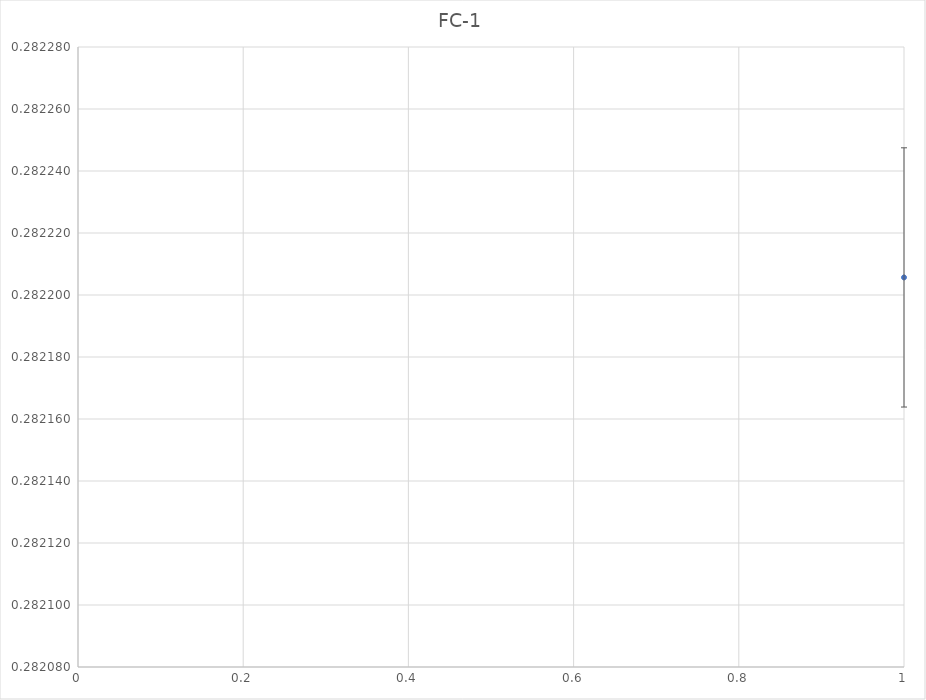
| Category | Series 0 |
|---|---|
| 0 | 0.282 |
| 1 | 0.282 |
| 2 | 0.282 |
| 3 | 0.282 |
| 4 | 0.282 |
| 5 | 0.282 |
| 6 | 0.282 |
| 7 | 0.282 |
| 8 | 0.282 |
| 9 | 0.282 |
| 10 | 0.282 |
| 11 | 0.282 |
| 12 | 0.282 |
| 13 | 0.282 |
| 14 | 0.282 |
| 15 | 0.282 |
| 16 | 0.282 |
| 17 | 0.282 |
| 18 | 0.282 |
| 19 | 0.282 |
| 20 | 0.282 |
| 21 | 0.282 |
| 22 | 0.282 |
| 23 | 0.282 |
| 24 | 0.282 |
| 25 | 0.282 |
| 26 | 0.282 |
| 27 | 0.282 |
| 28 | 0.282 |
| 29 | 0.282 |
| 30 | 0.282 |
| 31 | 0.282 |
| 32 | 0.282 |
| 33 | 0.282 |
| 34 | 0.282 |
| 35 | 0.282 |
| 36 | 0.282 |
| 37 | 0.282 |
| 38 | 0.282 |
| 39 | 0.282 |
| 40 | 0.282 |
| 41 | 0.282 |
| 42 | 0.282 |
| 43 | 0.282 |
| 44 | 0.282 |
| 45 | 0.282 |
| 46 | 0.282 |
| 47 | 0.282 |
| 48 | 0.282 |
| 49 | 0.282 |
| 50 | 0.282 |
| 51 | 0.282 |
| 52 | 0.282 |
| 53 | 0.282 |
| 54 | 0.282 |
| 55 | 0.282 |
| 56 | 0.282 |
| 57 | 0.282 |
| 58 | 0.282 |
| 59 | 0.282 |
| 60 | 0.282 |
| 61 | 0.282 |
| 62 | 0.282 |
| 63 | 0.282 |